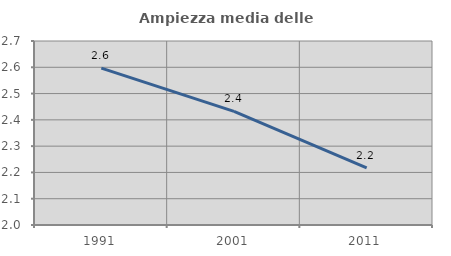
| Category | Ampiezza media delle famiglie |
|---|---|
| 1991.0 | 2.597 |
| 2001.0 | 2.432 |
| 2011.0 | 2.218 |